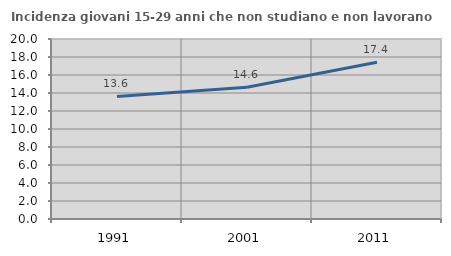
| Category | Incidenza giovani 15-29 anni che non studiano e non lavorano  |
|---|---|
| 1991.0 | 13.614 |
| 2001.0 | 14.646 |
| 2011.0 | 17.408 |